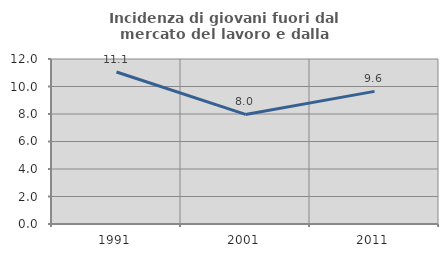
| Category | Incidenza di giovani fuori dal mercato del lavoro e dalla formazione  |
|---|---|
| 1991.0 | 11.058 |
| 2001.0 | 7.969 |
| 2011.0 | 9.645 |